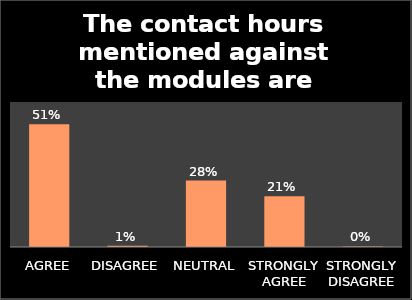
| Category | Series 0 |
|---|---|
| AGREE | 0.507 |
| DISAGREE | 0.005 |
| NEUTRAL | 0.275 |
| STRONGLY AGREE | 0.21 |
| STRONGLY DISAGREE | 0.002 |